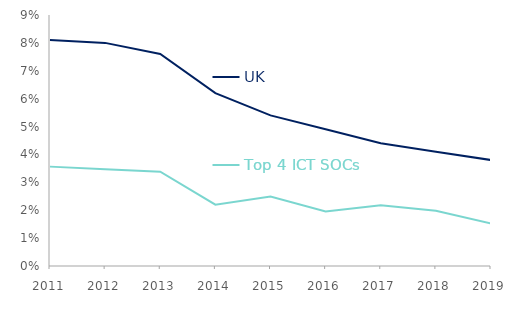
| Category | UK | Top 4 ICT SOCs |
|---|---|---|
| 2011 | 0.081 | 0.036 |
| 2012 | 0.08 | 0.035 |
| 2013 | 0.076 | 0.034 |
| 2014 | 0.062 | 0.022 |
| 2015 | 0.054 | 0.025 |
| 2016 | 0.049 | 0.02 |
| 2017 | 0.044 | 0.022 |
| 2018 | 0.041 | 0.02 |
| 2019 | 0.038 | 0.015 |